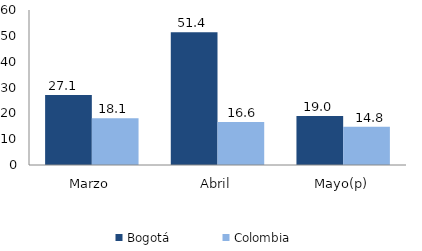
| Category | Bogotá | Colombia |
|---|---|---|
| Marzo | 27.096 | 18.1 |
| Abril | 51.415 | 16.631 |
| Mayo(p) | 18.957 | 14.784 |